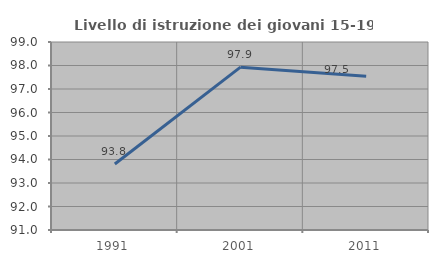
| Category | Livello di istruzione dei giovani 15-19 anni |
|---|---|
| 1991.0 | 93.808 |
| 2001.0 | 97.929 |
| 2011.0 | 97.541 |